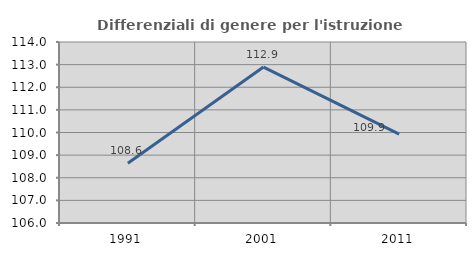
| Category | Differenziali di genere per l'istruzione superiore |
|---|---|
| 1991.0 | 108.639 |
| 2001.0 | 112.891 |
| 2011.0 | 109.93 |